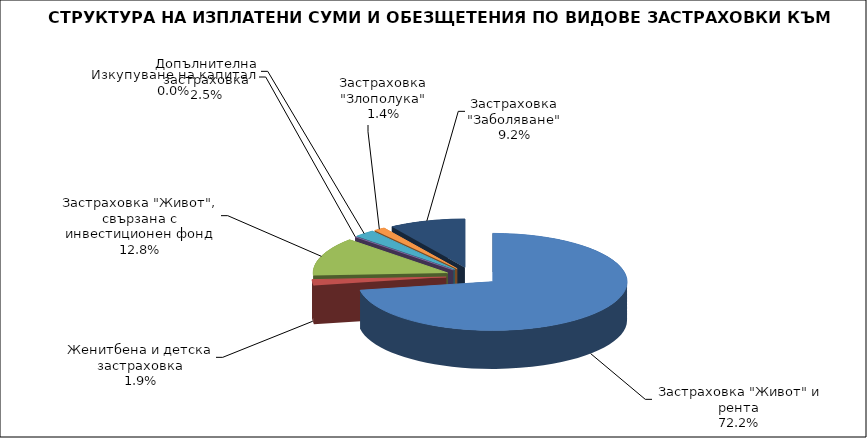
| Category | Series 0 |
|---|---|
|  Застраховка "Живот" и рента | 66381393.263 |
| Женитбена и детска застраховка | 1789739.74 |
| Застраховка "Живот", свързана с инвестиционен фонд | 11812560.77 |
| Изкупуване на капитал | 0 |
| Допълнителна застраховка | 2295578.999 |
| Застраховка "Злополука" | 1244268.29 |
| Застраховка "Заболяване" | 8412422.94 |